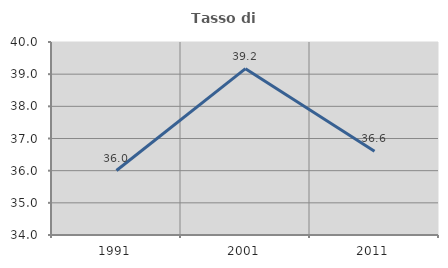
| Category | Tasso di occupazione   |
|---|---|
| 1991.0 | 36.004 |
| 2001.0 | 39.171 |
| 2011.0 | 36.603 |